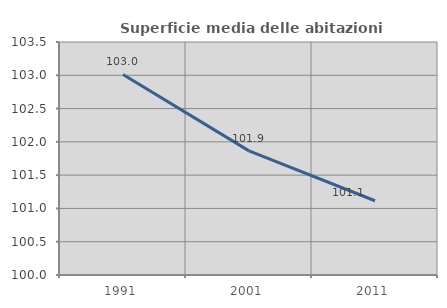
| Category | Superficie media delle abitazioni occupate |
|---|---|
| 1991.0 | 103.013 |
| 2001.0 | 101.865 |
| 2011.0 | 101.115 |